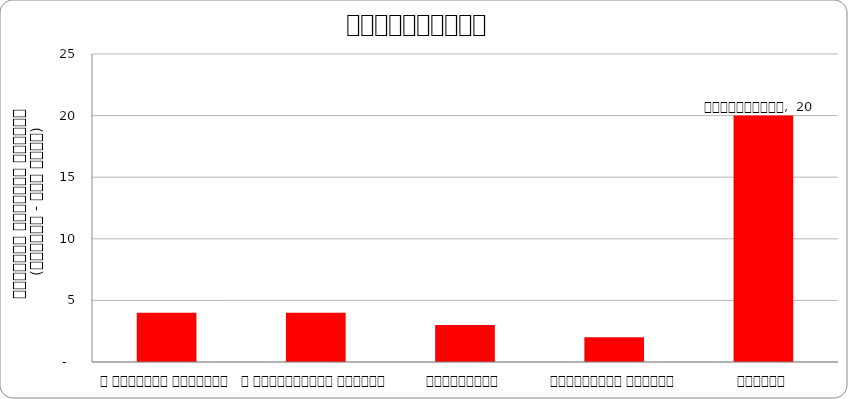
| Category | अर्थतन्त्र |
|---|---|
| द हिमालयन टाइम्स् | 4 |
| द काठमाण्डौं पोस्ट् | 4 |
| कान्तिपुर | 3 |
| अन्नपूर्ण पोस्ट् | 2 |
| नागरिक | 20 |